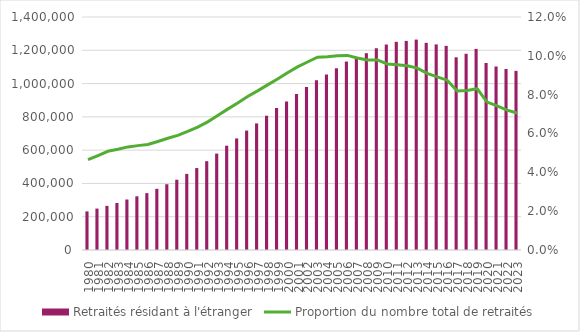
| Category | Retraités résidant à l'étranger |
|---|---|
| 1980.0 | 231944 |
| 1981.0 | 248781 |
| 1982.0 | 265189 |
| 1983.0 | 282329 |
| 1984.0 | 303409 |
| 1985.0 | 322670 |
| 1986.0 | 341644 |
| 1987.0 | 367584 |
| 1988.0 | 395100 |
| 1989.0 | 422287 |
| 1990.0 | 457279 |
| 1991.0 | 492316 |
| 1992.0 | 533708 |
| 1993.0 | 579228 |
| 1994.0 | 626799 |
| 1995.0 | 670309 |
| 1996.0 | 717681 |
| 1997.0 | 760667 |
| 1998.0 | 806814 |
| 1999.0 | 852694 |
| 2000.0 | 892432 |
| 2001.0 | 937920 |
| 2002.0 | 979085 |
| 2003.0 | 1020050 |
| 2004.0 | 1054992 |
| 2005.0 | 1091887 |
| 2006.0 | 1132382 |
| 2007.0 | 1156471 |
| 2008.0 | 1182510 |
| 2009.0 | 1212251 |
| 2010.0 | 1234693 |
| 2011.0 | 1250791 |
| 2012.0 | 1256324 |
| 2013.0 | 1264294 |
| 2014.0 | 1244684 |
| 2015.0 | 1235287 |
| 2016.0 | 1226545 |
| 2017.0 | 1157786 |
| 2018.0 | 1179007 |
| 2019.0 | 1208268 |
| 2020.0 | 1123741 |
| 2021.0 | 1102647 |
| 2022.0 | 1087595 |
| 2023.0 | 1076238 |